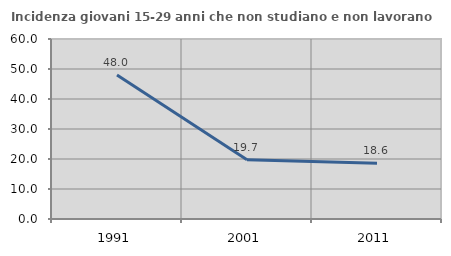
| Category | Incidenza giovani 15-29 anni che non studiano e non lavorano  |
|---|---|
| 1991.0 | 47.99 |
| 2001.0 | 19.721 |
| 2011.0 | 18.624 |